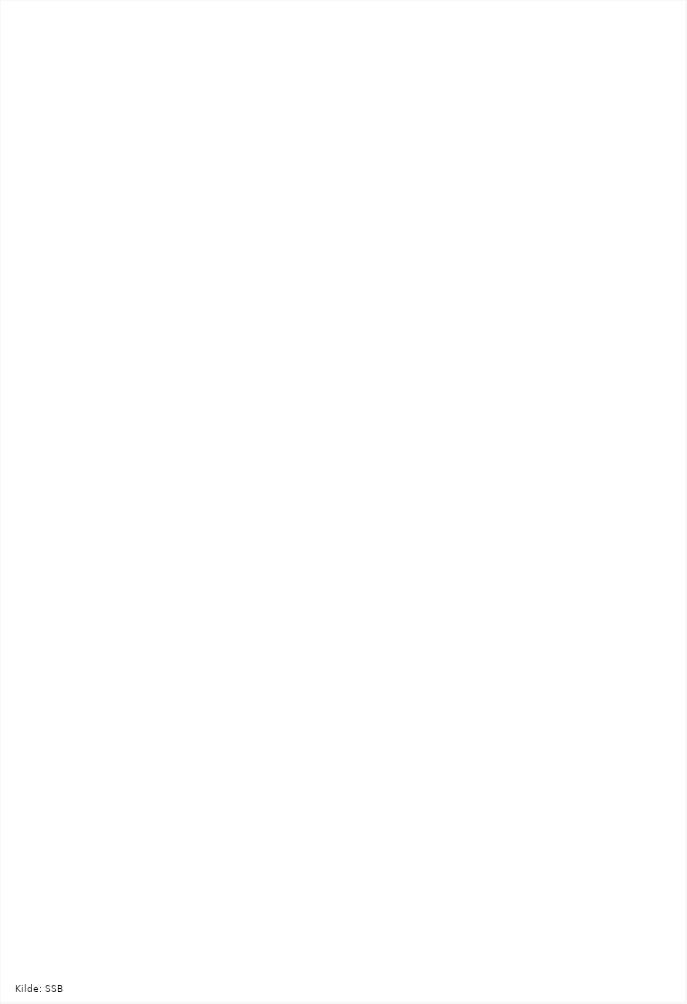
| Category | dyrka | dyrkbar |
|---|---|---|
| Meråker | 0 | 0 |
| Midtre Gauldal | 0 | 0 |
| Verran | 0 | 0 |
| Flatanger | 0 | 0 |
| Frosta | 0 | 0 |
| Agdenes | 0 | 0 |
| Inderøy | 0 | 0 |
| Namsskogan | 0 | 0 |
| Tydal | 0 | 0 |
| Roan | 0 | 0 |
| Klæbu | 0 | 0 |
| Røyrvik | 0 | 0 |
| Grong | 0 | 0 |
| Snillfjord | 0 | 0 |
| Namdalseid | 1 | 0 |
| Frøya | 1 | 0 |
| Osen | 1 | 0 |
| Vikna | 2 | 0 |
| Bjugn | 1 | 1 |
| Leka | 2 | 0 |
| Fosnes | 1 | 1 |
| Namsos | 0 | 3 |
| Meldal | 3 | 0 |
| Lierne | 4 | 0 |
| Skaun | 4 | 0 |
| Hitra | 4 | 0 |
| Høylandet | 0 | 5 |
| Røros | 5 | 1 |
| Snåsa | 0 | 6 |
| Åfjord | 7 | 0 |
| Selbu | 9 | 0 |
| Verdal | 9 | 0 |
| Holtålen | 5 | 4 |
| Indre Fosen | 10 | 0 |
| Hemne | 10 | 0 |
| Overhalla | 6 | 5 |
| Oppdal | 11 | 2 |
| Rindal | 13 | 1 |
| Melhus | 18 | 0 |
| Ørland | 18 | 0 |
| Levanger | 16 | 4 |
| Orkdal | 15 | 5 |
| Nærøy | 2 | 24 |
| Trondheim | 62 | 7 |
| Malvik | 77 | 0 |
| Stjørdal | 70 | 10 |
| Steinkjer | 88 | 0 |
| Rennebu | 122 | 229 |